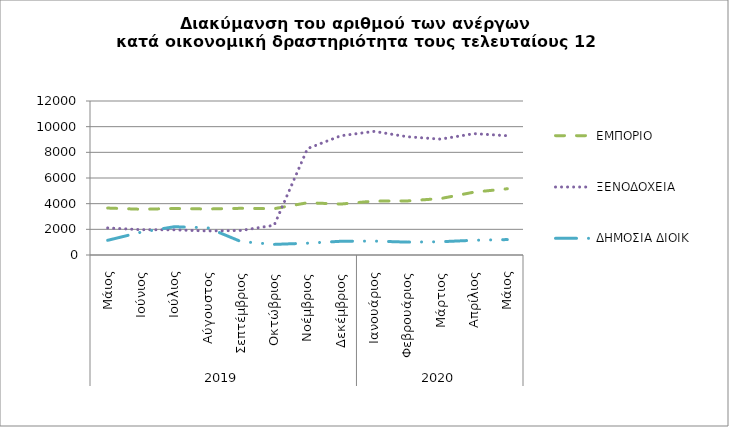
| Category | ΕΜΠΟΡΙΟ | ΞΕΝΟΔΟΧΕΙΑ | ΔΗΜΟΣΙΑ ΔΙΟΙΚ |
|---|---|---|---|
| 0 | 3658 | 2108 | 1144 |
| 1 | 3564 | 1972 | 1777 |
| 2 | 3623 | 1961 | 2202 |
| 3 | 3586 | 1872 | 2125 |
| 4 | 3637 | 1911 | 1050 |
| 5 | 3610 | 2319 | 826 |
| 6 | 4072 | 8292 | 922 |
| 7 | 3969 | 9290 | 1069 |
| 8 | 4202 | 9632 | 1085 |
| 9 | 4212 | 9214 | 1003 |
| 10 | 4400 | 9028 | 1034 |
| 11 | 4898 | 9457 | 1149 |
| 12 | 5162 | 9293 | 1202 |